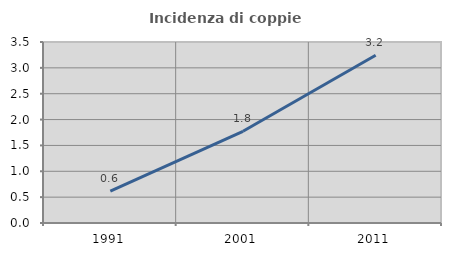
| Category | Incidenza di coppie miste |
|---|---|
| 1991.0 | 0.619 |
| 2001.0 | 1.774 |
| 2011.0 | 3.244 |